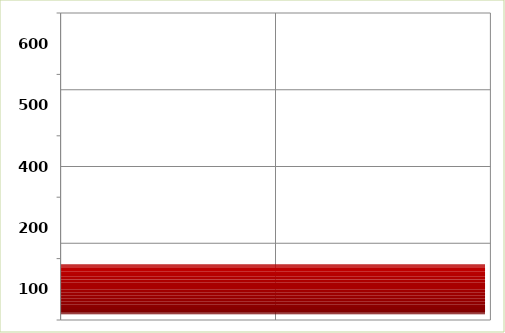
| Category | Series 0 |
|---|---|
| 100.0 | 9875125.92 |
| 200.0 | 0 |
| 400.0 | 0 |
| 500.0 | 0 |
| 600.0 | 0 |